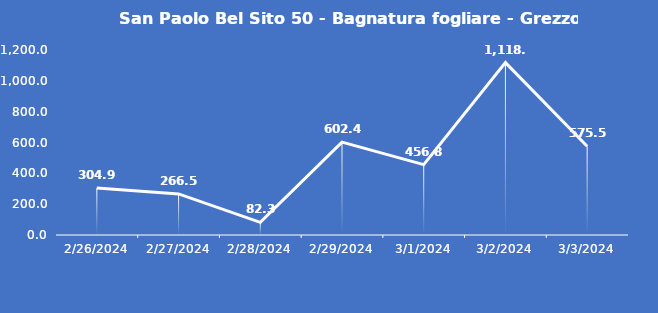
| Category | San Paolo Bel Sito 50 - Bagnatura fogliare - Grezzo (min) |
|---|---|
| 2/26/24 | 304.9 |
| 2/27/24 | 266.5 |
| 2/28/24 | 82.3 |
| 2/29/24 | 602.4 |
| 3/1/24 | 456.8 |
| 3/2/24 | 1118.1 |
| 3/3/24 | 575.5 |